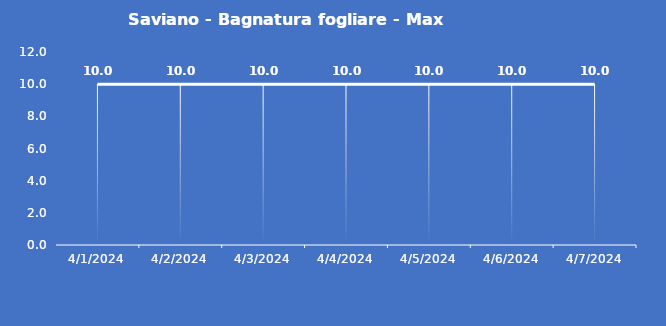
| Category | Saviano - Bagnatura fogliare - Max (min) |
|---|---|
| 4/1/24 | 10 |
| 4/2/24 | 10 |
| 4/3/24 | 10 |
| 4/4/24 | 10 |
| 4/5/24 | 10 |
| 4/6/24 | 10 |
| 4/7/24 | 10 |